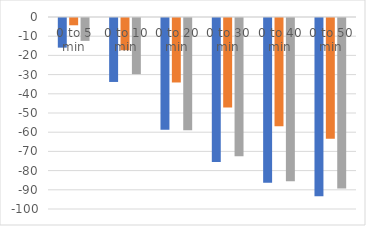
| Category | Series 0 | -3.791666667 | Series 2 |
|---|---|---|---|
| 0 to 5 min | -15.438 | -3.792 | -11.917 |
| 0 to 10 min | -33.312 | -16.792 | -29.25 |
| 0 to 20 min | -58.229 | -33.583 | -58.5 |
| 0 to 30 min | -75.021 | -46.583 | -72.042 |
| 0 to 40 min | -85.854 | -56.333 | -85.042 |
| 0 to 50 min | -92.896 | -62.833 | -88.833 |